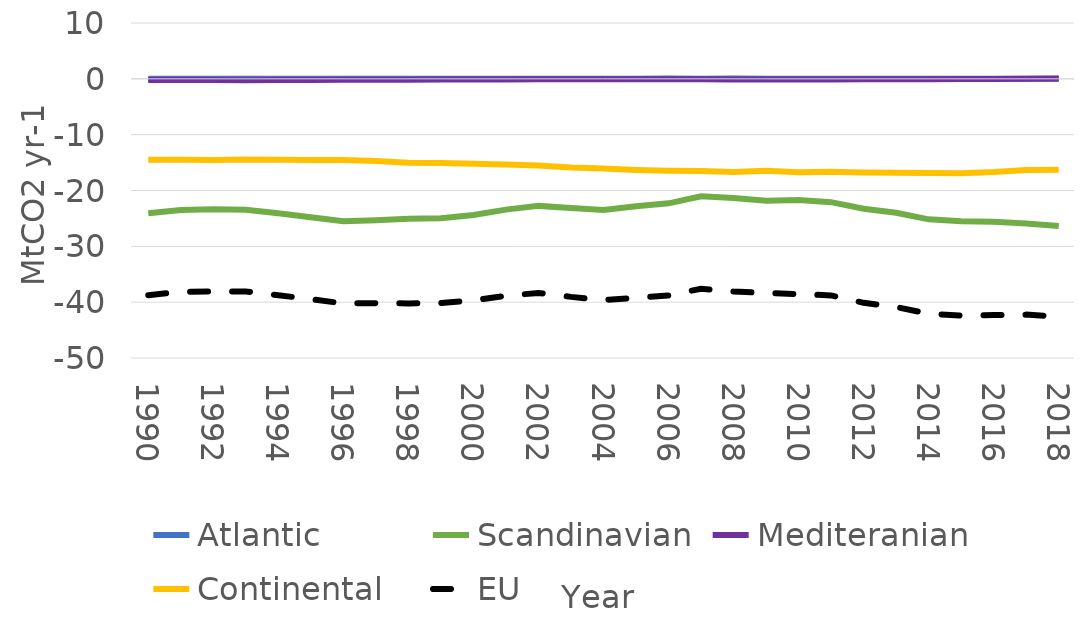
| Category | Atlantic | Scandinavian | Mediteranian | Continental | EU |
|---|---|---|---|---|---|
| 1990 | 0.032 | -24.08 | -0.212 | -14.501 | -38.761 |
| 1991 | 0.032 | -23.474 | -0.218 | -14.48 | -38.141 |
| 1992 | 0.032 | -23.361 | -0.225 | -14.525 | -38.079 |
| 1993 | 0.032 | -23.439 | -0.232 | -14.434 | -38.073 |
| 1994 | 0.032 | -24.084 | -0.222 | -14.475 | -38.75 |
| 1995 | 0.032 | -24.788 | -0.204 | -14.515 | -39.475 |
| 1996 | 0.032 | -25.517 | -0.185 | -14.55 | -40.22 |
| 1997 | 0.032 | -25.328 | -0.166 | -14.711 | -40.173 |
| 1998 | 0.032 | -25.066 | -0.147 | -15.05 | -40.23 |
| 1999 | 0.032 | -24.989 | -0.13 | -15.08 | -40.167 |
| 2000 | 0.032 | -24.381 | -0.119 | -15.226 | -39.693 |
| 2001 | 0.032 | -23.422 | -0.103 | -15.354 | -38.847 |
| 2002 | 0.032 | -22.755 | -0.087 | -15.544 | -38.354 |
| 2003 | 0.032 | -23.124 | -0.074 | -15.883 | -39.05 |
| 2004 | 0.032 | -23.508 | -0.068 | -16.069 | -39.613 |
| 2005 | 0.032 | -22.838 | -0.068 | -16.325 | -39.199 |
| 2006 | 0.043 | -22.295 | -0.076 | -16.466 | -38.794 |
| 2007 | 0.036 | -21.041 | -0.085 | -16.497 | -37.588 |
| 2008 | 0.04 | -21.343 | -0.102 | -16.683 | -38.088 |
| 2009 | 0.029 | -21.828 | -0.111 | -16.456 | -38.366 |
| 2010 | 0.026 | -21.708 | -0.113 | -16.752 | -38.548 |
| 2011 | 0.024 | -22.086 | -0.101 | -16.634 | -38.797 |
| 2012 | 0.021 | -23.266 | -0.089 | -16.784 | -40.117 |
| 2013 | 0.028 | -23.995 | -0.074 | -16.826 | -40.867 |
| 2014 | 0.02 | -25.166 | -0.052 | -16.874 | -42.073 |
| 2015 | 0.022 | -25.504 | -0.038 | -16.889 | -42.409 |
| 2016 | 0.026 | -25.617 | -0.017 | -16.691 | -42.3 |
| 2017 | 0.025 | -25.93 | 0.008 | -16.333 | -42.23 |
| 2018 | 0.03 | -26.36 | 0.04 | -16.283 | -42.573 |